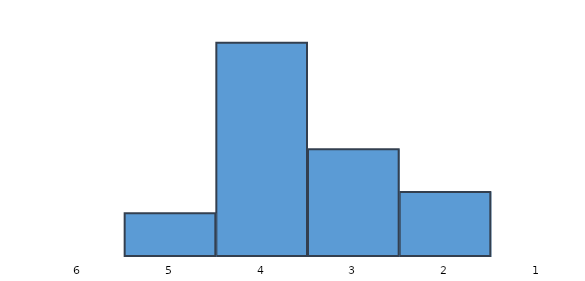
| Category | Series 0 |
|---|---|
| 1 | 0 |
| 2 | 3 |
| 3 | 5 |
| 4 | 10 |
| 5 | 2 |
| 6 | 0 |